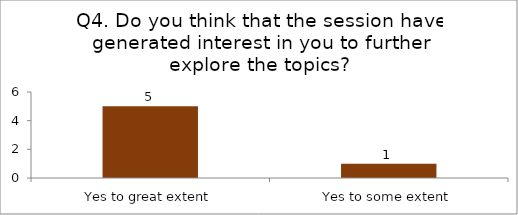
| Category | Q4. Do you think that the session have generated interest in you to further explore the topics? |
|---|---|
| Yes to great extent | 5 |
| Yes to some extent | 1 |